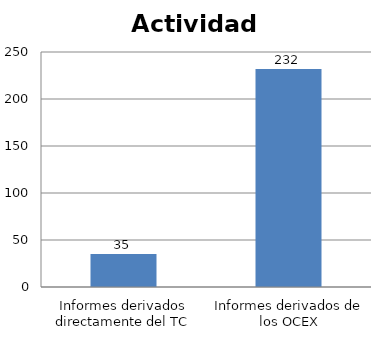
| Category | Series 0 |
|---|---|
| Informes derivados directamente del TC | 35 |
| Informes derivados de los OCEX | 232 |